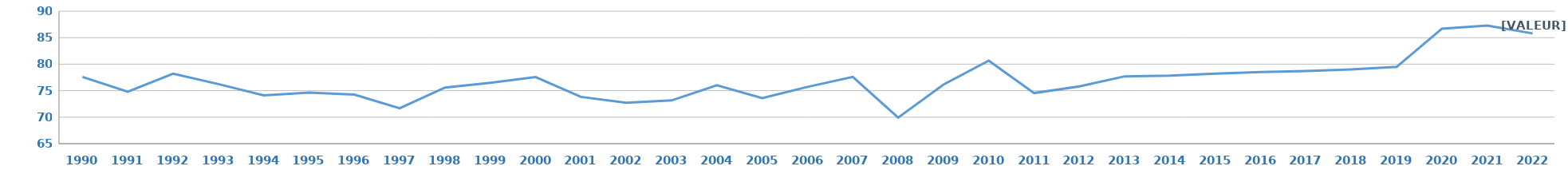
| Category | DNB |
|---|---|
| 1990.0 | 77.6 |
| 1991.0 | 74.8 |
| 1992.0 | 78.2 |
| 1993.0 | 76.234 |
| 1994.0 | 74.113 |
| 1995.0 | 74.636 |
| 1996.0 | 74.266 |
| 1997.0 | 71.671 |
| 1998.0 | 75.591 |
| 1999.0 | 76.496 |
| 2000.0 | 77.571 |
| 2001.0 | 73.827 |
| 2002.0 | 72.708 |
| 2003.0 | 73.16 |
| 2004.0 | 76.007 |
| 2005.0 | 73.595 |
| 2006.0 | 75.708 |
| 2007.0 | 77.608 |
| 2008.0 | 69.904 |
| 2009.0 | 76.151 |
| 2010.0 | 80.66 |
| 2011.0 | 74.548 |
| 2012.0 | 75.804 |
| 2013.0 | 77.704 |
| 2014.0 | 77.844 |
| 2015.0 | 78.198 |
| 2016.0 | 78.499 |
| 2017.0 | 78.7 |
| 2018.0 | 79 |
| 2019.0 | 79.487 |
| 2020.0 | 86.7 |
| 2021.0 | 87.3 |
| 2022.0 | 85.8 |